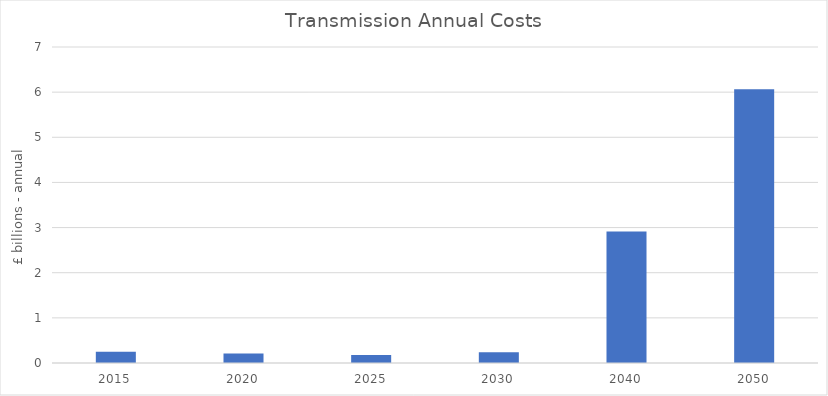
| Category | Series 0 |
|---|---|
| 2015.0 | 0.247 |
| 2020.0 | 0.211 |
| 2025.0 | 0.178 |
| 2030.0 | 0.24 |
| 2040.0 | 2.911 |
| 2050.0 | 6.065 |